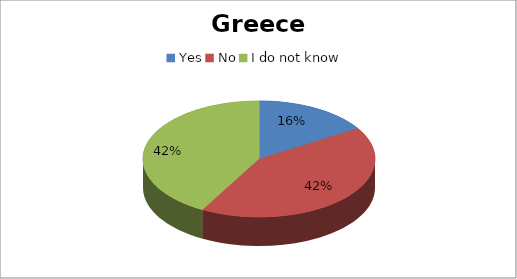
| Category | Series 0 |
|---|---|
| Yes | 10 |
| No | 26 |
| I do not know | 26 |